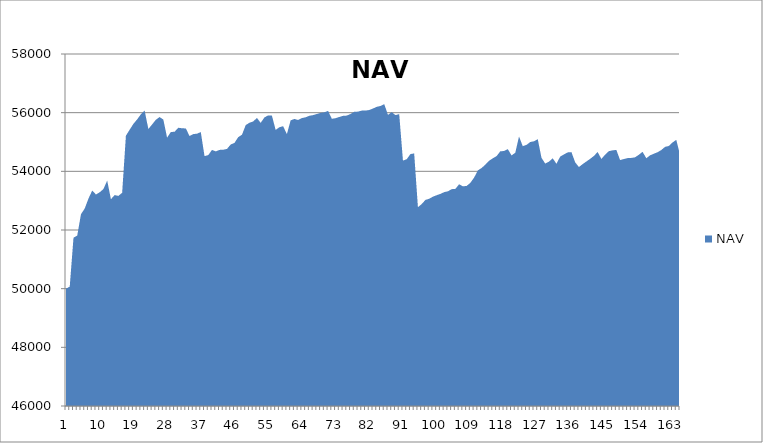
| Category | NAV |
|---|---|
| 0 | 50000 |
| 1 | 50069.444 |
| 2 | 51736.444 |
| 3 | 51809.343 |
| 4 | 52539.343 |
| 5 | 52733.57 |
| 6 | 53070.527 |
| 7 | 53346.212 |
| 8 | 53210.13 |
| 9 | 53285.788 |
| 10 | 53396.685 |
| 11 | 53684.185 |
| 12 | 53050.597 |
| 13 | 53191.058 |
| 14 | 53162.649 |
| 15 | 53270.317 |
| 16 | 55214.762 |
| 17 | 55418.583 |
| 18 | 55617.273 |
| 19 | 55770.477 |
| 20 | 55945.477 |
| 21 | 56069.601 |
| 22 | 55444.601 |
| 23 | 55597.925 |
| 24 | 55757.558 |
| 25 | 55851.308 |
| 26 | 55764.06 |
| 27 | 55148.361 |
| 28 | 55340.028 |
| 29 | 55349.317 |
| 30 | 55485.393 |
| 31 | 55468.704 |
| 32 | 55461.038 |
| 33 | 55205.356 |
| 34 | 55270.356 |
| 35 | 55282.57 |
| 36 | 55341.011 |
| 37 | 54517.482 |
| 38 | 54554.291 |
| 39 | 54731.016 |
| 40 | 54679.093 |
| 41 | 54730.595 |
| 42 | 54736.73 |
| 43 | 54765.085 |
| 44 | 54915.643 |
| 45 | 54969.86 |
| 46 | 55164.665 |
| 47 | 55247.746 |
| 48 | 55575.668 |
| 49 | 55657.905 |
| 50 | 55701.032 |
| 51 | 55819.28 |
| 52 | 55652.834 |
| 53 | 55838.604 |
| 54 | 55905.769 |
| 55 | 55898.888 |
| 56 | 55410.9 |
| 57 | 55504.564 |
| 58 | 55537.603 |
| 59 | 55268.471 |
| 60 | 55737.858 |
| 61 | 55785.708 |
| 62 | 55749.829 |
| 63 | 55815.591 |
| 64 | 55842.34 |
| 65 | 55894.021 |
| 66 | 55916.828 |
| 67 | 55955.697 |
| 68 | 55991.896 |
| 69 | 56012.065 |
| 70 | 56060.293 |
| 71 | 55791.443 |
| 72 | 55810.674 |
| 73 | 55852.843 |
| 74 | 55892.018 |
| 75 | 55900.069 |
| 76 | 55955.739 |
| 77 | 56030.918 |
| 78 | 56036.168 |
| 79 | 56069.975 |
| 80 | 56071.656 |
| 81 | 56090.406 |
| 82 | 56141.798 |
| 83 | 56199.159 |
| 84 | 56228.237 |
| 85 | 56292.573 |
| 86 | 55924.369 |
| 87 | 56019.106 |
| 88 | 55916.165 |
| 89 | 55950.09 |
| 90 | 54367.13 |
| 91 | 54411.811 |
| 92 | 54588.933 |
| 93 | 54611.197 |
| 94 | 52777.117 |
| 95 | 52883.107 |
| 96 | 53025.651 |
| 97 | 53064.908 |
| 98 | 53135.652 |
| 99 | 53186.005 |
| 100 | 53229.789 |
| 101 | 53290.192 |
| 102 | 53319.038 |
| 103 | 53392.112 |
| 104 | 53401.462 |
| 105 | 53559.878 |
| 106 | 53489.526 |
| 107 | 53501.684 |
| 108 | 53607.597 |
| 109 | 53785.178 |
| 110 | 54030.211 |
| 111 | 54113.452 |
| 112 | 54226.272 |
| 113 | 54358.625 |
| 114 | 54444.736 |
| 115 | 54518.421 |
| 116 | 54681.882 |
| 117 | 54693.454 |
| 118 | 54759.719 |
| 119 | 54542.637 |
| 120 | 54631.804 |
| 121 | 55189.582 |
| 122 | 54857.283 |
| 123 | 54902.45 |
| 124 | 54998.878 |
| 125 | 55024.352 |
| 126 | 55097.595 |
| 127 | 54460.788 |
| 128 | 54265.386 |
| 129 | 54330.201 |
| 130 | 54444.032 |
| 131 | 54258.967 |
| 132 | 54502.531 |
| 133 | 54576.689 |
| 134 | 54645.616 |
| 135 | 54655.645 |
| 136 | 54306.491 |
| 137 | 54146.917 |
| 138 | 54245.601 |
| 139 | 54336.218 |
| 140 | 54425.943 |
| 141 | 54524.223 |
| 142 | 54658.516 |
| 143 | 54423.271 |
| 144 | 54567.668 |
| 145 | 54687.668 |
| 146 | 54715.668 |
| 147 | 54729.584 |
| 148 | 54383.43 |
| 149 | 54420.248 |
| 150 | 54450.791 |
| 151 | 54457.1 |
| 152 | 54477.818 |
| 153 | 54563.112 |
| 154 | 54666.053 |
| 155 | 54446.722 |
| 156 | 54545.273 |
| 157 | 54599.818 |
| 158 | 54651.247 |
| 159 | 54725.665 |
| 160 | 54833.165 |
| 161 | 54864.415 |
| 162 | 54983.165 |
| 163 | 55073.97 |
| 164 | 54564.416 |